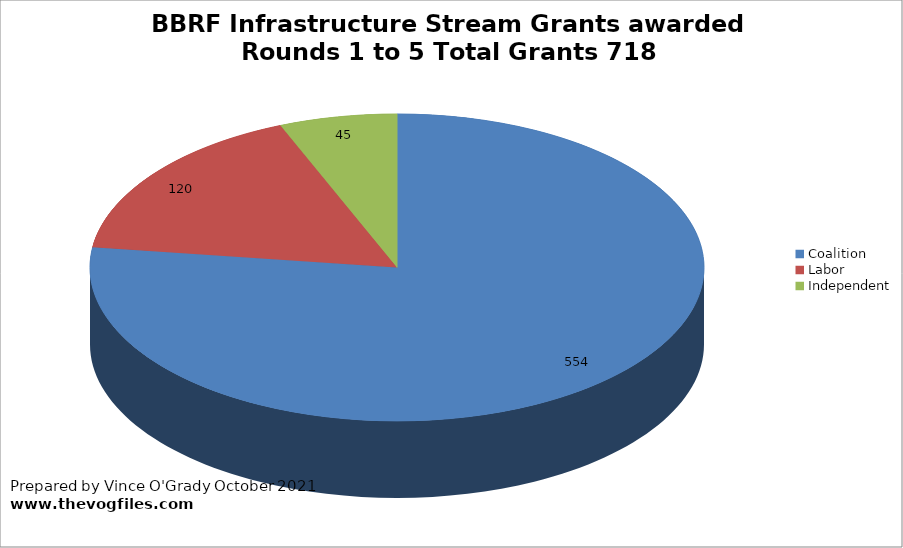
| Category | BBRF Infrastructure Stream Grants awarded Rounds 1 to 5 Total Grants 718 |
|---|---|
| Coalition | 553.5 |
| Labor | 120 |
| Independent | 44.5 |